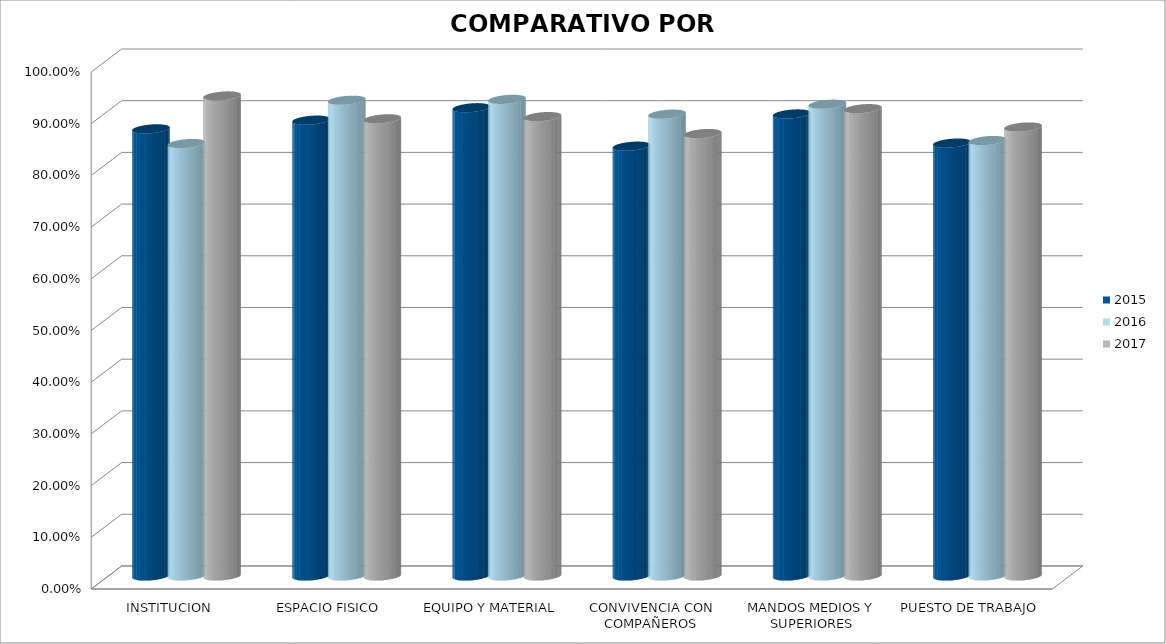
| Category | 2015 | 2016 | 2017 |
|---|---|---|---|
| INSTITUCION | 0.865 | 0.837 | 0.929 |
| ESPACIO FISICO | 0.882 | 0.92 | 0.884 |
| EQUIPO Y MATERIAL | 0.906 | 0.922 | 0.889 |
| CONVIVENCIA CON COMPAÑEROS | 0.831 | 0.893 | 0.856 |
| MANDOS MEDIOS Y SUPERIORES | 0.894 | 0.913 | 0.904 |
| PUESTO DE TRABAJO | 0.837 | 0.842 | 0.869 |